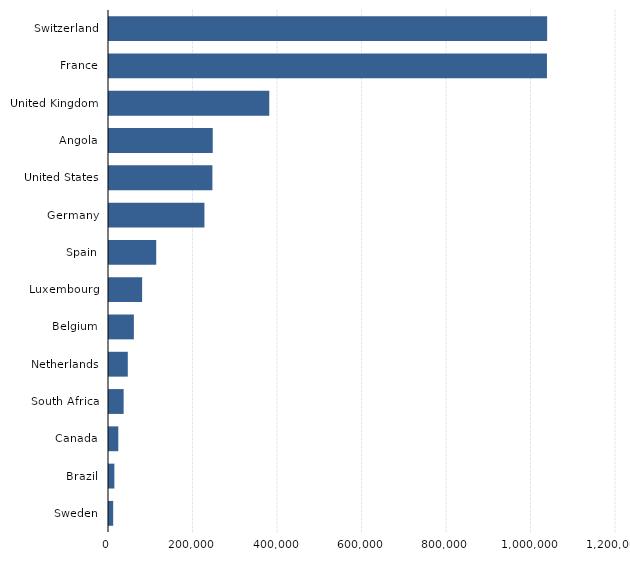
| Category | Series 2 |
|---|---|
| Switzerland | 1037020 |
| France | 1036570 |
| United Kingdom | 379350 |
| Angola | 245530 |
| United States | 244740 |
| Germany | 225870 |
| Spain | 111780 |
| Luxembourg | 78400 |
| Belgium | 58900 |
| Netherlands | 44470 |
| South Africa | 34650 |
| Canada | 21990 |
| Brazil | 12720 |
| Sweden | 9890 |